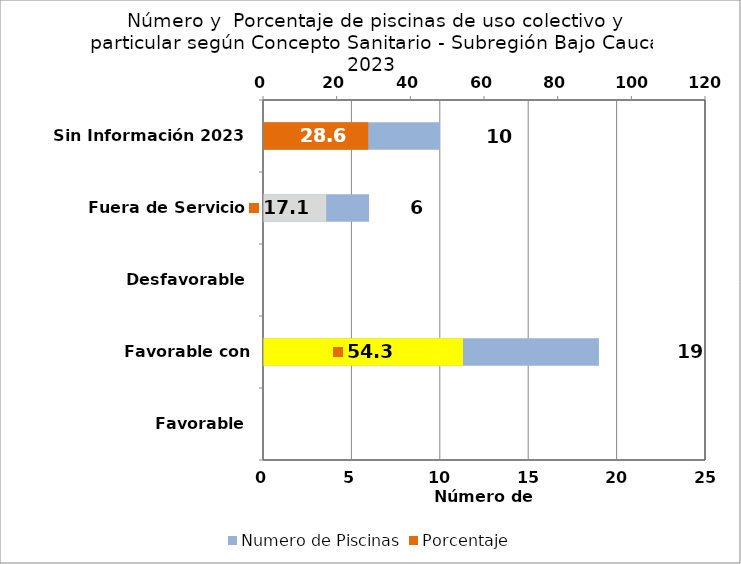
| Category | Numero de Piscinas |
|---|---|
| Favorable | 0 |
| Favorable con Requerimientos | 19 |
| Desfavorable | 0 |
| Fuera de Servicio | 6 |
| Sin Información 2023 | 10 |